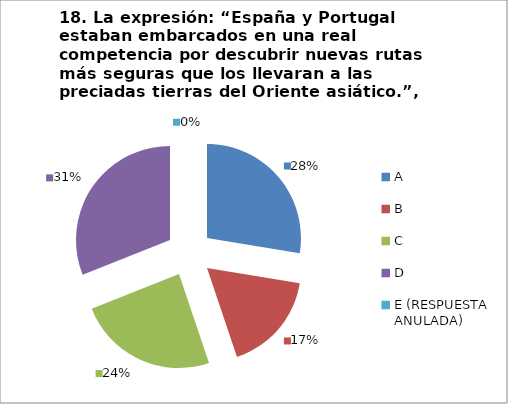
| Category | CANTIDAD DE RESPUESTAS PREGUNTA (18) | PORCENTAJE |
|---|---|---|
| A | 8 | 0.276 |
| B | 5 | 0.172 |
| C | 7 | 0.241 |
| D | 9 | 0.31 |
| E (RESPUESTA ANULADA) | 0 | 0 |